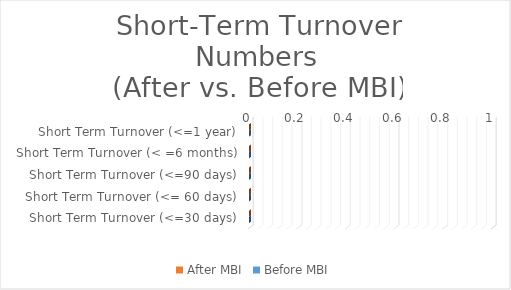
| Category | After MBI | Before MBI |
|---|---|---|
| Short Term Turnover (<=1 year) | 0 | 0 |
| Short Term Turnover (< =6 months) | 0 | 0 |
| Short Term Turnover (<=90 days) | 0 | 0 |
| Short Term Turnover (<= 60 days) | 0 | 0 |
| Short Term Turnover (<=30 days) | 0 | 0 |